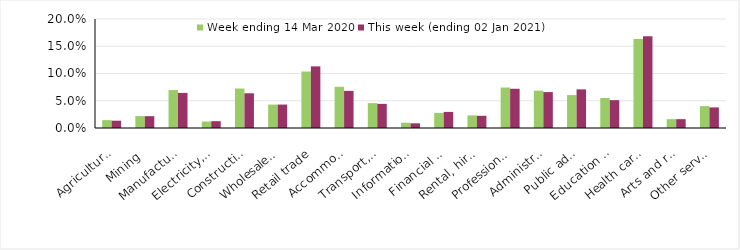
| Category | Week ending 14 Mar 2020 | This week (ending 02 Jan 2021) |
|---|---|---|
| Agriculture, forestry and fishing | 0.014 | 0.013 |
| Mining | 0.022 | 0.022 |
| Manufacturing | 0.07 | 0.064 |
| Electricity, gas, water and waste services | 0.012 | 0.012 |
| Construction | 0.072 | 0.064 |
| Wholesale trade | 0.043 | 0.043 |
| Retail trade | 0.104 | 0.113 |
| Accommodation and food services | 0.076 | 0.068 |
| Transport, postal and warehousing | 0.046 | 0.044 |
| Information media and telecommunications | 0.01 | 0.009 |
| Financial and insurance services | 0.028 | 0.03 |
| Rental, hiring and real estate services | 0.023 | 0.022 |
| Professional, scientific and technical services | 0.074 | 0.072 |
| Administrative and support services | 0.068 | 0.066 |
| Public administration and safety | 0.06 | 0.071 |
| Education and training | 0.055 | 0.051 |
| Health care and social assistance | 0.163 | 0.168 |
| Arts and recreation services | 0.016 | 0.016 |
| Other services | 0.04 | 0.038 |